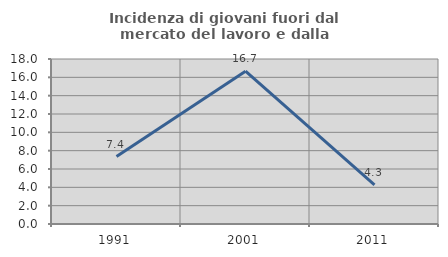
| Category | Incidenza di giovani fuori dal mercato del lavoro e dalla formazione  |
|---|---|
| 1991.0 | 7.353 |
| 2001.0 | 16.667 |
| 2011.0 | 4.255 |